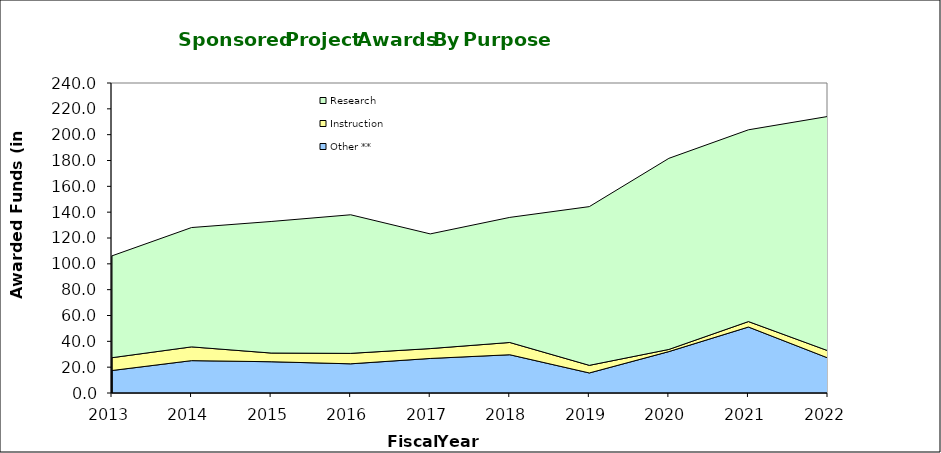
| Category |  Other **  |  Instruction  |  Research  |
|---|---|---|---|
| 2013.0 | 17415722 | 9918293 | 78852872 |
| 2014.0 | 25056053 | 10647546 | 92392249 |
| 2015.0 | 24203849 | 6730586 | 101841190 |
| 2016.0 | 22595090 | 8082996 | 107304830 |
| 2017.0 | 26734202 | 7652057 | 88790412 |
| 2018.0 | 29618046.61 | 9494623.35 | 96839919.23 |
| 2019.0 | 15515250.94 | 5892594.01 | 122892610.3 |
| 2020.0 | 32049607.82 | 1687298 | 147935518.76 |
| 2021.0 | 51074179 | 4228527 | 148466129 |
| 2022.0 | 27081765 | 5611801 | 181425291 |